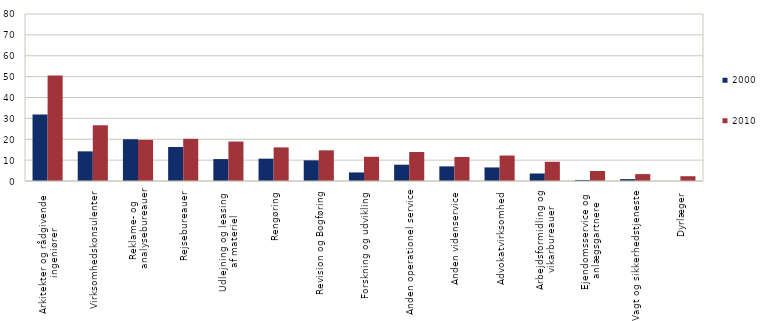
| Category | 2000 | 2010 |
|---|---|---|
| Arkitekter og rådgivende 
ingeniører | 31.9 | 50.5 |
| Virksomhedskonsulenter | 14.2 | 26.7 |
| Reklame- og 
analysebureauer | 20 | 19.7 |
| Rejsebureauer | 16.3 | 20.2 |
| Udlejning og leasing 
af materiel | 10.5 | 18.9 |
| Rengøring | 10.7 | 16.1 |
| Revision og Bogføring | 9.9 | 14.7 |
| Forskning og udvikling | 4.1 | 11.6 |
| Anden operationel service | 7.8 | 13.9 |
| Anden videnservice | 7 | 11.5 |
| Advokatvirksomhed | 6.5 | 12.2 |
| Arbejdsformidling og
 vikarbureauer | 3.6 | 9.2 |
| Ejendomsservice og 
anlægsgartnere | 0.5 | 4.8 |
| Vagt og sikkerhedstjeneste | 0.9 | 3.3 |
| Dyrlæger | 0 | 2.3 |